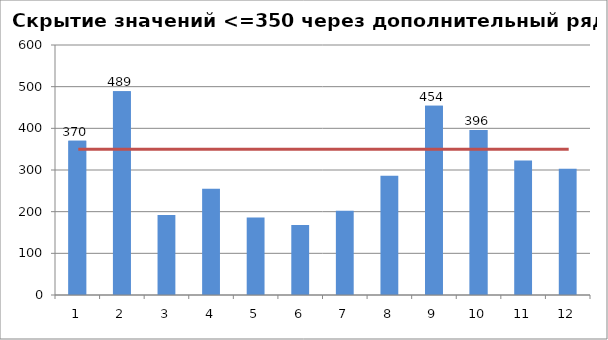
| Category | Динамика продаж | Дополнительный ряд |
|---|---|---|
| 0 | 370 | 370 |
| 1 | 489 | 489 |
| 2 | 192 | 0 |
| 3 | 255 | 0 |
| 4 | 186 | 0 |
| 5 | 168 | 0 |
| 6 | 202 | 0 |
| 7 | 286 | 0 |
| 8 | 454 | 454 |
| 9 | 396 | 396 |
| 10 | 323 | 0 |
| 11 | 303 | 0 |